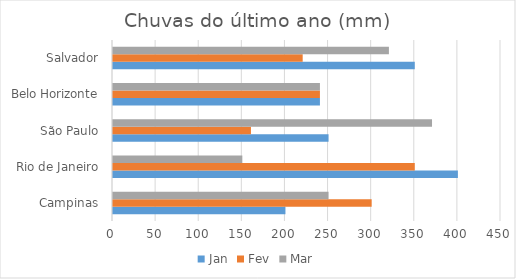
| Category | Jan | Fev | Mar |
|---|---|---|---|
| Campinas | 200 | 300 | 250 |
| Rio de Janeiro | 400 | 350 | 150 |
| São Paulo | 250 | 160 | 370 |
| Belo Horizonte | 240 | 240 | 240 |
| Salvador | 350 | 220 | 320 |